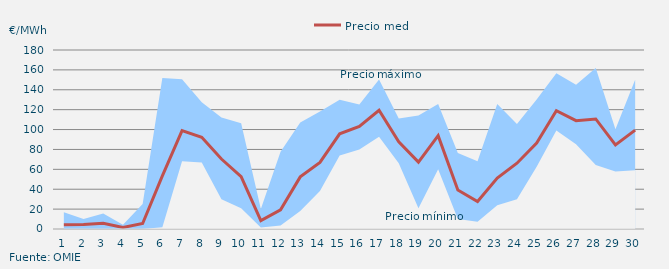
| Category | Precio medio |
|---|---|
| 1.0 | 4.353 |
| 2.0 | 4.608 |
| 3.0 | 5.811 |
| 4.0 | 1.516 |
| 5.0 | 5.474 |
| 6.0 | 53.402 |
| 7.0 | 98.986 |
| 8.0 | 92.18 |
| 9.0 | 70.39 |
| 10.0 | 52.721 |
| 11.0 | 8.427 |
| 12.0 | 19.35 |
| 13.0 | 52.386 |
| 14.0 | 66.904 |
| 15.0 | 95.748 |
| 16.0 | 103.262 |
| 17.0 | 119.356 |
| 18.0 | 87.586 |
| 19.0 | 67.286 |
| 20.0 | 93.884 |
| 21.0 | 39.203 |
| 22.0 | 27.667 |
| 23.0 | 51.156 |
| 24.0 | 66.17 |
| 25.0 | 86.331 |
| 26.0 | 118.919 |
| 27.0 | 108.955 |
| 28.0 | 110.665 |
| 29.0 | 84.519 |
| 30.0 | 99.379 |